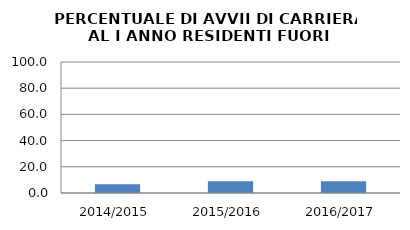
| Category | 2014/2015 2015/2016 2016/2017 |
|---|---|
| 2014/2015 | 6.619 |
| 2015/2016 | 9.016 |
| 2016/2017 | 8.98 |